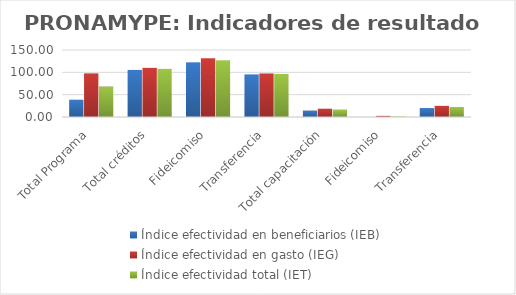
| Category | Índice efectividad en beneficiarios (IEB) | Índice efectividad en gasto (IEG)  | Índice efectividad total (IET) |
|---|---|---|---|
| Total Programa | 38.613 | 97.67 | 68.142 |
| Total créditos | 105.4 | 109.985 | 107.693 |
| Fideicomiso | 122.372 | 131.491 | 126.931 |
| Transferencia | 95.39 | 97.335 | 96.362 |
| Total capacitación | 14.327 | 18.498 | 16.413 |
| Fideicomiso | 0 | 2.535 | 1.267 |
| Transferencia | 20.051 | 24.884 | 22.467 |